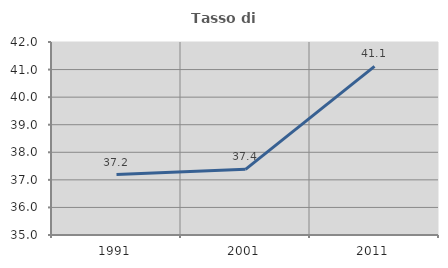
| Category | Tasso di occupazione   |
|---|---|
| 1991.0 | 37.191 |
| 2001.0 | 37.382 |
| 2011.0 | 41.116 |